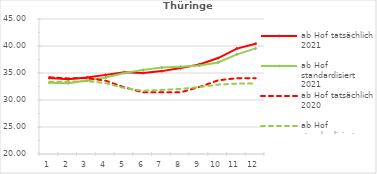
| Category | ab Hof tatsächlich 2021 | ab Hof standardisiert 2021 | ab Hof tatsächlich 2020 | ab Hof standardisiert 2020 |
|---|---|---|---|---|
| 0 | 34.075 | 33.208 | 34.203 | 33.357 |
| 1 | 33.847 | 33.118 | 33.992 | 33.386 |
| 2 | 34.171 | 33.598 | 34.068 | 33.5 |
| 3 | 34.653 | 34.151 | 33.577 | 33.12 |
| 4 | 35.149 | 35.006 | 32.342 | 32.211 |
| 5 | 35 | 35.581 | 31.414 | 31.714 |
| 6 | 35.349 | 36.039 | 31.415 | 31.864 |
| 7 | 35.917 | 36.177 | 31.416 | 32.055 |
| 8 | 36.59 | 36.389 | 32.413 | 32.392 |
| 9 | 37.773 | 36.951 | 33.643 | 32.847 |
| 10 | 39.523 | 38.453 | 34.04 | 33.044 |
| 11 | 40.426 | 39.552 | 34.048 | 33.053 |